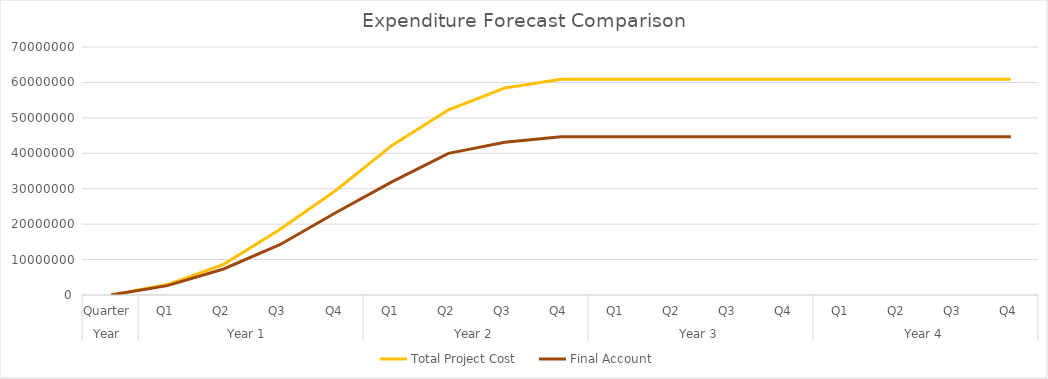
| Category | Total Project Cost | Final Account |
|---|---|---|
| 0 | 0 | 0 |
| 1 | 2947367.054 | 2647367.054 |
| 2 | 8641144.317 | 7341144.317 |
| 3 | 18494119.303 | 14194119.303 |
| 4 | 29577193.762 | 23277193.762 |
| 5 | 42292281.383 | 31992281.383 |
| 6 | 52273137.997 | 39973137.997 |
| 7 | 58417545.76 | 43117545.76 |
| 8 | 60896013.51 | 44694280.11 |
| 9 | 60896013.51 | 44694280.11 |
| 10 | 60896013.51 | 44694280.11 |
| 11 | 60896013.51 | 44694280.11 |
| 12 | 60896013.51 | 44694280.11 |
| 13 | 60896013.51 | 44694280.11 |
| 14 | 60896013.51 | 44694280.11 |
| 15 | 60896013.51 | 44694280.11 |
| 16 | 60896013.51 | 44694280.11 |